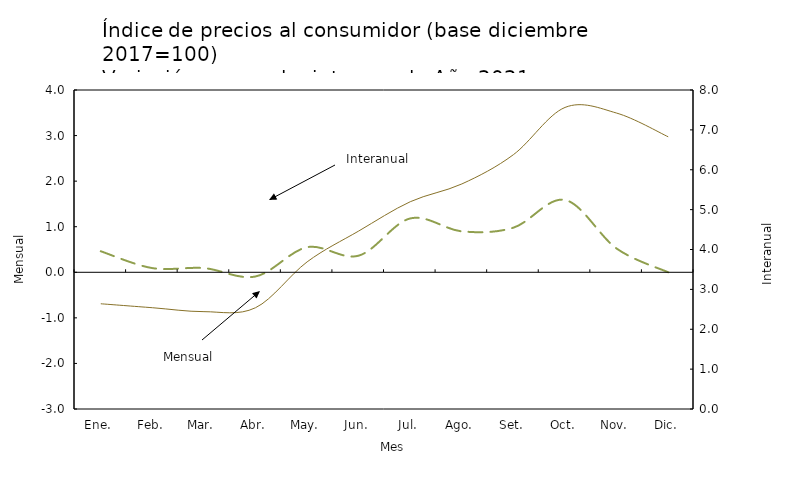
| Category | Mensual |
|---|---|
| Ene. | 0.461 |
| Feb. | 0.092 |
| Mar. | 0.092 |
| Abr. | -0.092 |
| May. | 0.55 |
| Jun. | 0.365 |
| Jul. | 1.182 |
| Ago. | 0.898 |
| Set. | 0.98 |
| Oct. | 1.587 |
| Nov. | 0.521 |
| Dic. | 0 |